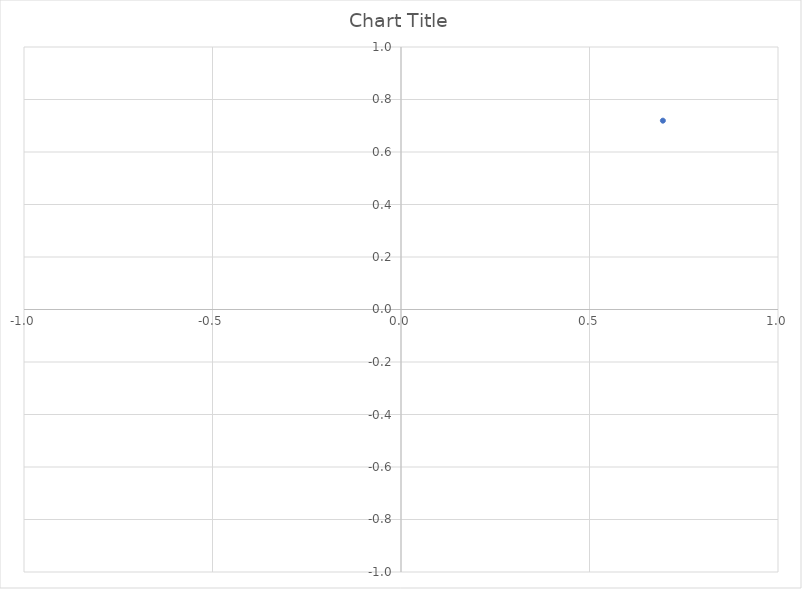
| Category | Series 0 |
|---|---|
| 0.6946583704589974 | 0.719 |